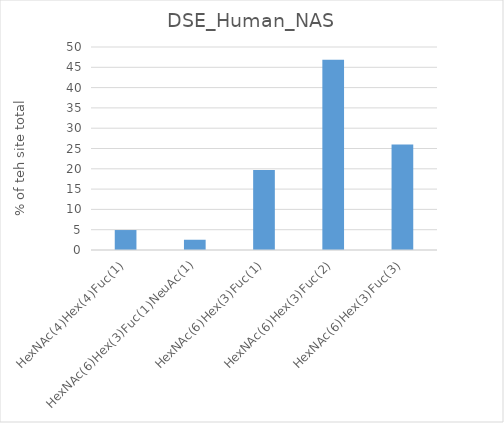
| Category | Series 0 |
|---|---|
| HexNAc(4)Hex(4)Fuc(1) | 4.918 |
| HexNAc(6)Hex(3)Fuc(1)NeuAc(1) | 2.526 |
| HexNAc(6)Hex(3)Fuc(1) | 19.724 |
| HexNAc(6)Hex(3)Fuc(2) | 46.872 |
| HexNAc(6)Hex(3)Fuc(3) | 25.959 |